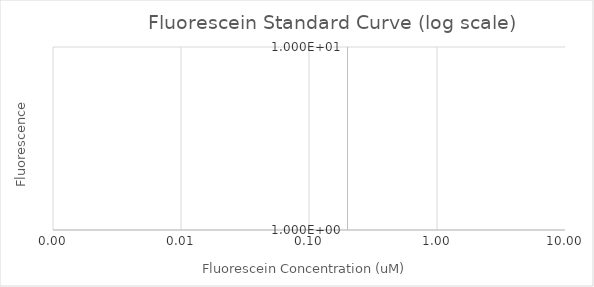
| Category | Series 1 |
|---|---|
| 10.0 | 0 |
| 5.0 | 0 |
| 2.5 | 0 |
| 1.25 | 0 |
| 0.625 | 0 |
| 0.3125 | 0 |
| 0.15625 | 0 |
| 0.078125 | 0 |
| 0.0390625 | 0 |
| 0.01953125 | 0 |
| 0.009765625 | 0 |